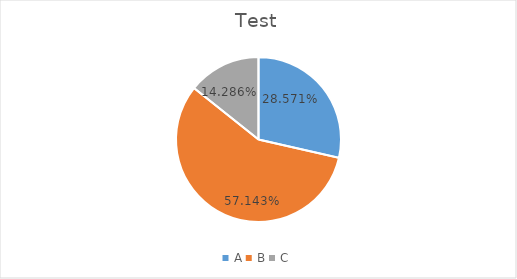
| Category | Test |
|---|---|
| A | 2 |
| B | 4 |
| C | 1 |